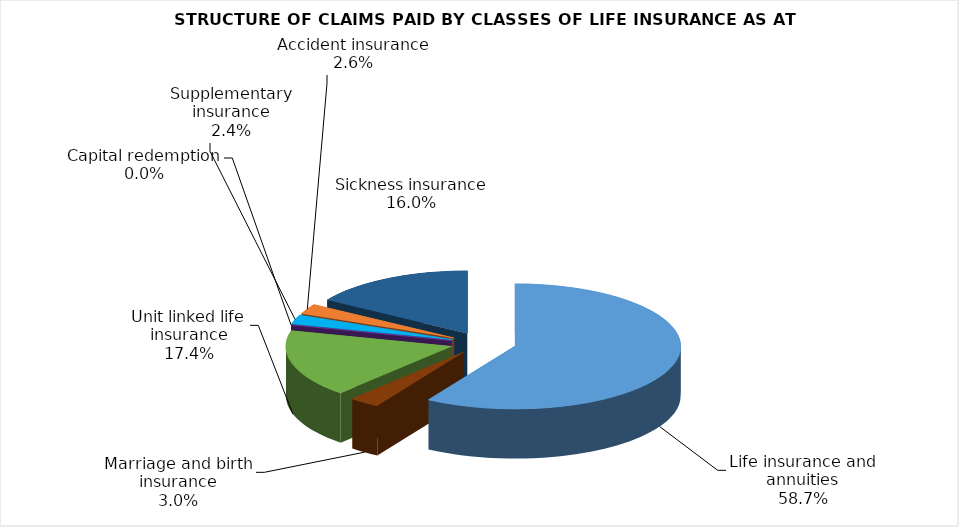
| Category | Life insurance and annuities |
|---|---|
| Life insurance and annuities | 40688319.14 |
| Marriage and birth insurance | 2063868.103 |
| Unit linked life insurance | 12027469.917 |
| Capital redemption | 0 |
| Supplementary insurance | 1633830.128 |
| Accident insurance | 1782384.695 |
| Sickness insurance | 11108839.268 |